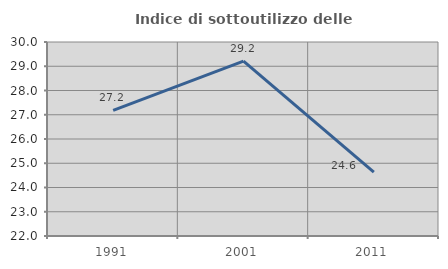
| Category | Indice di sottoutilizzo delle abitazioni  |
|---|---|
| 1991.0 | 27.182 |
| 2001.0 | 29.211 |
| 2011.0 | 24.631 |